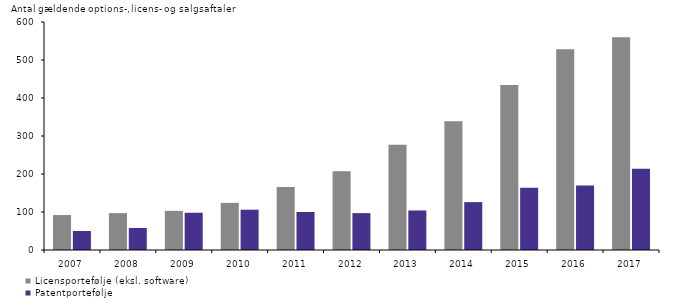
| Category | Licensportefølje (eksl. software) | Patentportefølje |
|---|---|---|
| 2007.0 | 92 | 50 |
| 2008.0 | 97 | 58 |
| 2009.0 | 103 | 98 |
| 2010.0 | 124 | 106 |
| 2011.0 | 166 | 100 |
| 2012.0 | 207 | 97 |
| 2013.0 | 277 | 104 |
| 2014.0 | 339 | 126 |
| 2015.0 | 434 | 164 |
| 2016.0 | 528 | 170 |
| 2017.0 | 560 | 214 |